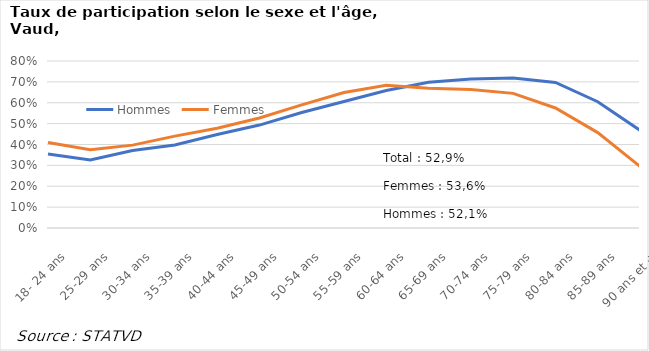
| Category | Hommes | Femmes |
|---|---|---|
| 18- 24 ans | 0.354 | 0.41 |
| 25-29 ans | 0.326 | 0.375 |
| 30-34 ans | 0.371 | 0.397 |
| 35-39 ans | 0.398 | 0.44 |
| 40-44 ans | 0.448 | 0.478 |
| 45-49 ans | 0.493 | 0.527 |
| 50-54 ans | 0.553 | 0.59 |
| 55-59 ans | 0.606 | 0.649 |
| 60-64 ans | 0.659 | 0.684 |
| 65-69 ans | 0.698 | 0.67 |
| 70-74 ans | 0.714 | 0.663 |
| 75-79 ans | 0.718 | 0.645 |
| 80-84 ans | 0.697 | 0.575 |
| 85-89 ans | 0.605 | 0.457 |
| 90 ans et + | 0.468 | 0.295 |